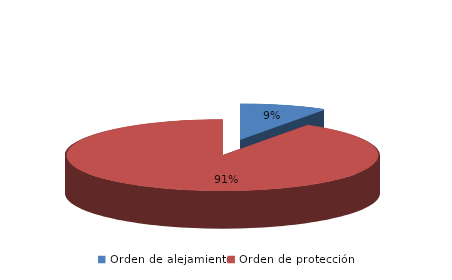
| Category | Series 0 |
|---|---|
| Orden de alejamiento | 18 |
| Orden de protección | 183 |